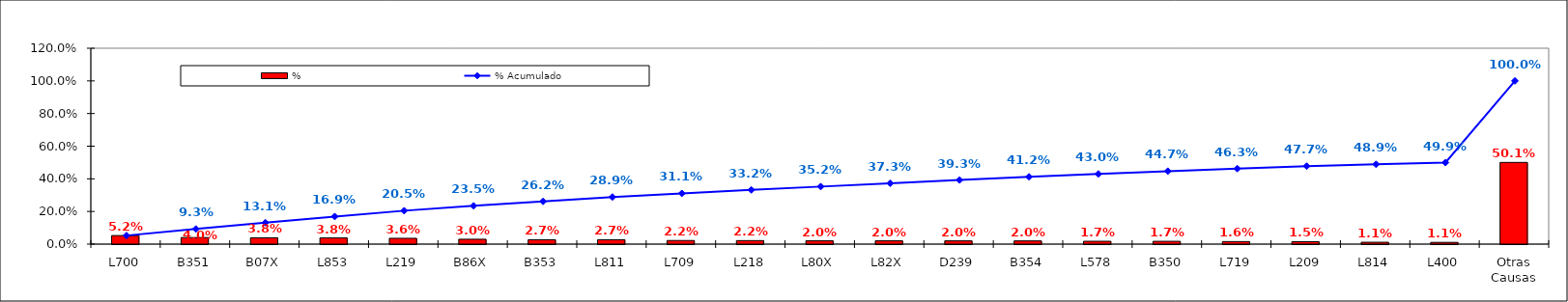
| Category | % |
|---|---|
| L700 | 0.052 |
| B351 | 0.04 |
| B07X | 0.038 |
| L853 | 0.038 |
| L219 | 0.036 |
| B86X | 0.03 |
| B353 | 0.027 |
| L811 | 0.027 |
| L709 | 0.022 |
| L218 | 0.022 |
| L80X | 0.02 |
| L82X | 0.02 |
| D239 | 0.02 |
| B354 | 0.02 |
| L578 | 0.017 |
| B350 | 0.017 |
| L719 | 0.016 |
| L209 | 0.015 |
| L814 | 0.011 |
| L400 | 0.011 |
| Otras Causas | 0.501 |